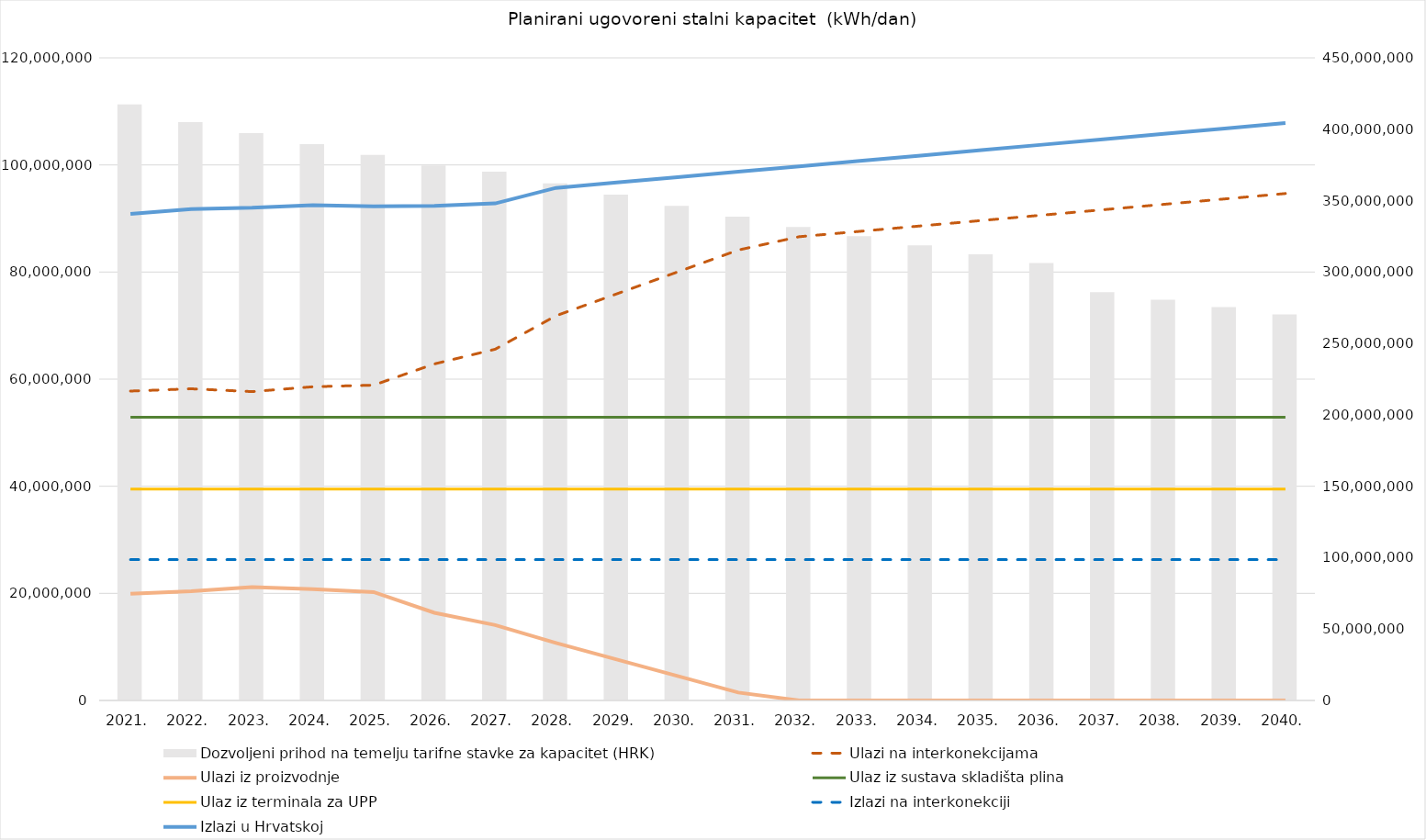
| Category | Dozvoljeni prihod na temelju tarifne stavke za kapacitet (HRK) |
|---|---|
| 2021. | 417440147 |
| 2022. | 405049390 |
| 2023. | 397211939.298 |
| 2024. | 389526138.333 |
| 2025. | 381989052.779 |
| 2026. | 374597805.084 |
| 2027. | 370270706 |
| 2028. | 362136214.062 |
| 2029. | 354180429.102 |
| 2030. | 346399425.1 |
| 2031. | 338789362.286 |
| 2032. | 331605318 |
| 2033. | 325089082.94 |
| 2034. | 318700895.643 |
| 2035. | 312438239.898 |
| 2036. | 306298648.937 |
| 2037. | 285860727 |
| 2038. | 280584953.346 |
| 2039. | 275406548.043 |
| 2040. | 270323714.085 |